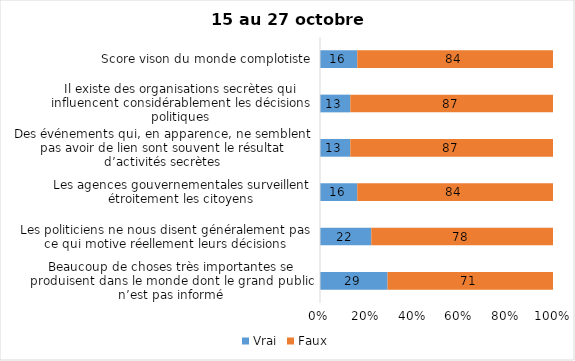
| Category | Vrai | Faux |
|---|---|---|
| Beaucoup de choses très importantes se produisent dans le monde dont le grand public n’est pas informé | 29 | 71 |
| Les politiciens ne nous disent généralement pas ce qui motive réellement leurs décisions | 22 | 78 |
| Les agences gouvernementales surveillent étroitement les citoyens | 16 | 84 |
| Des événements qui, en apparence, ne semblent pas avoir de lien sont souvent le résultat d’activités secrètes | 13 | 87 |
| Il existe des organisations secrètes qui influencent considérablement les décisions politiques | 13 | 87 |
| Score vison du monde complotiste | 16 | 84 |